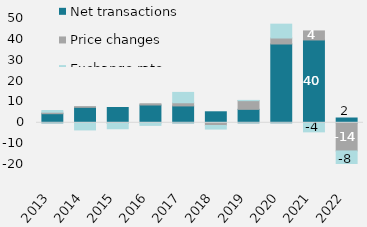
| Category | Net transactions | Price changes | Exchange rate differentials | #REF! |
|---|---|---|---|---|
| 2013 | 4357.041 | 703.092 | 824.066 |  |
| 2014 | 7395.537 | 341.401 | -3425.528 |  |
| 2015 | 7329.58 | -228.457 | -2627.507 |  |
| 2016 | 8528.929 | 591.666 | -1248.608 |  |
| 2017 | 8080.193 | 1522.047 | 4962.482 |  |
| 2018 | 5274.761 | -1305.442 | -1701.363 |  |
| 2019 | 6444.801 | 4170.168 | 119.784 |  |
| 2020 | 37776.483 | 2866.303 | 6640.065 |  |
| 2021 | 39703.618 | 4341.294 | -4349.484 |  |
| 2022 | 2291 | -13513 | -7552 |  |